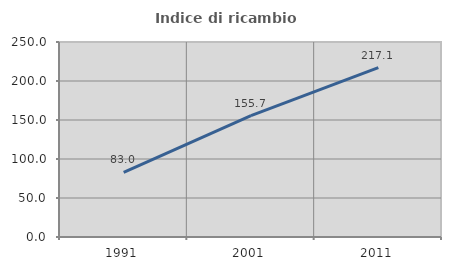
| Category | Indice di ricambio occupazionale  |
|---|---|
| 1991.0 | 82.955 |
| 2001.0 | 155.696 |
| 2011.0 | 217.105 |